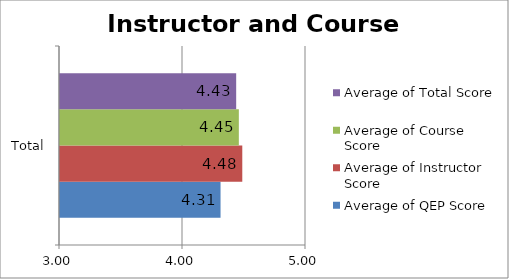
| Category | Average of QEP Score | Average of Instructor Score | Average of Course Score | Average of Total Score |
|---|---|---|---|---|
| Total | 4.305 | 4.482 | 4.454 | 4.432 |